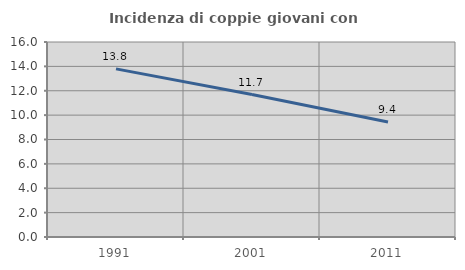
| Category | Incidenza di coppie giovani con figli |
|---|---|
| 1991.0 | 13.793 |
| 2001.0 | 11.688 |
| 2011.0 | 9.434 |